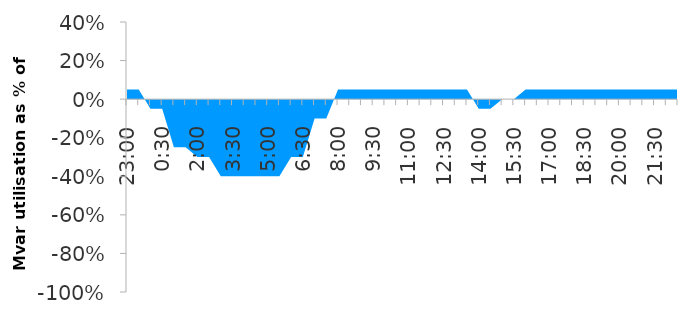
| Category | Series 0 |
|---|---|
| 0.9583333333333334 | 0.05 |
| 0.9791666666666666 | 0.05 |
| 0.0 | -0.05 |
| 0.020833333333333332 | -0.05 |
| 0.041666666666666664 | -0.25 |
| 0.0625 | -0.25 |
| 0.08333333333333333 | -0.3 |
| 0.10416666666666667 | -0.3 |
| 0.125 | -0.4 |
| 0.14583333333333334 | -0.4 |
| 0.16666666666666666 | -0.4 |
| 0.1875 | -0.4 |
| 0.20833333333333334 | -0.4 |
| 0.22916666666666666 | -0.4 |
| 0.25 | -0.3 |
| 0.2708333333333333 | -0.3 |
| 0.2916666666666667 | -0.1 |
| 0.3125 | -0.1 |
| 0.3333333333333333 | 0.05 |
| 0.3541666666666667 | 0.05 |
| 0.375 | 0.05 |
| 0.3958333333333333 | 0.05 |
| 0.4166666666666667 | 0.05 |
| 0.4375 | 0.05 |
| 0.4583333333333333 | 0.05 |
| 0.4791666666666667 | 0.05 |
| 0.5 | 0.05 |
| 0.5208333333333334 | 0.05 |
| 0.5416666666666666 | 0.05 |
| 0.5625 | 0.05 |
| 0.5833333333333334 | -0.05 |
| 0.6041666666666666 | -0.05 |
| 0.625 | 0 |
| 0.6458333333333334 | 0 |
| 0.6666666666666666 | 0.05 |
| 0.6875 | 0.05 |
| 0.7083333333333334 | 0.05 |
| 0.7291666666666666 | 0.05 |
| 0.75 | 0.05 |
| 0.7708333333333334 | 0.05 |
| 0.7916666666666666 | 0.05 |
| 0.8125 | 0.05 |
| 0.8333333333333334 | 0.05 |
| 0.8541666666666666 | 0.05 |
| 0.875 | 0.05 |
| 0.8958333333333334 | 0.05 |
| 0.9166666666666666 | 0.05 |
| 0.9375 | 0.05 |